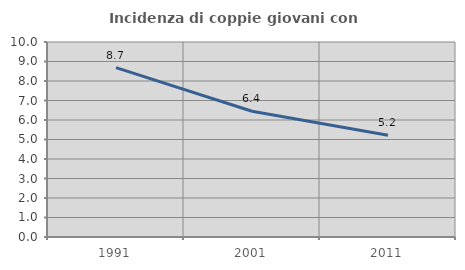
| Category | Incidenza di coppie giovani con figli |
|---|---|
| 1991.0 | 8.683 |
| 2001.0 | 6.446 |
| 2011.0 | 5.214 |